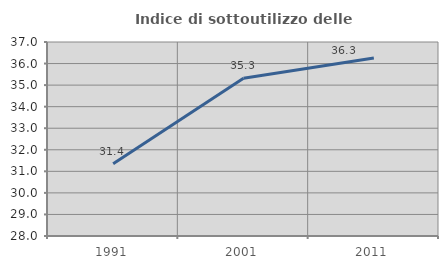
| Category | Indice di sottoutilizzo delle abitazioni  |
|---|---|
| 1991.0 | 31.352 |
| 2001.0 | 35.322 |
| 2011.0 | 36.261 |